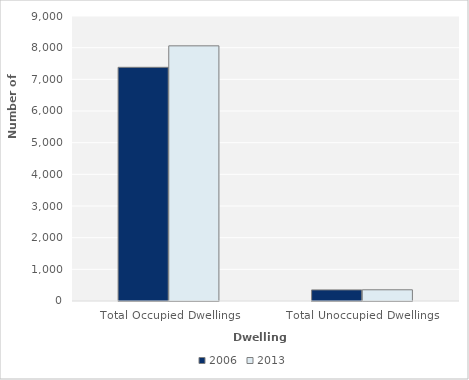
| Category | 2006 | 2013 |
|---|---|---|
| Total Occupied Dwellings | 7380 | 8058 |
| Total Unoccupied Dwellings | 351 | 354 |